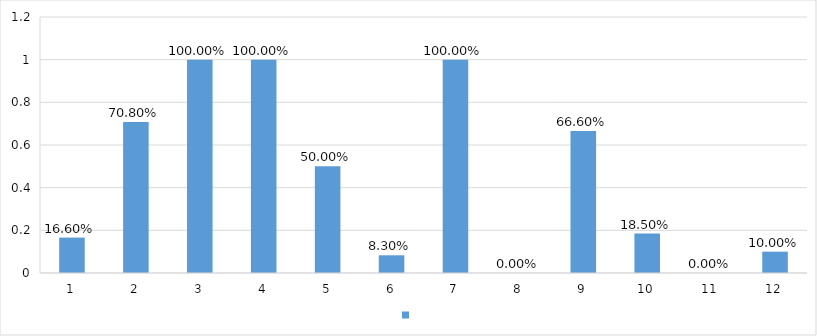
| Category | Series 0 |
|---|---|
| 1 | 0.166 |
| 2 | 0.708 |
| 3 | 1 |
| 4 | 1 |
| 5 | 0.5 |
| 6 | 0.083 |
| 7 | 1 |
| 8 | 0 |
| 9 | 0.666 |
| 10 | 0.185 |
| 11 | 0 |
| 12 | 0.1 |